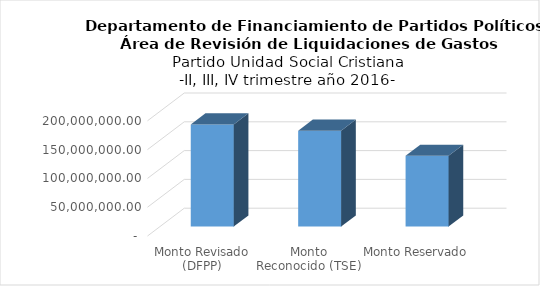
| Category | Series 0 |
|---|---|
| Monto Revisado (DFPP) | 177387203.65 |
| Monto Reconocido (TSE) | 166365585.84 |
| Monto Reservado  | 122931479.217 |